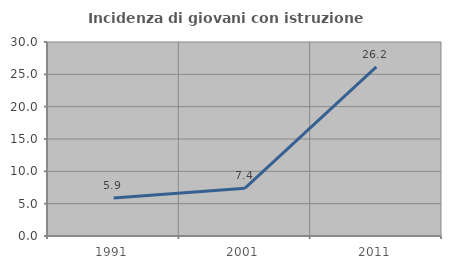
| Category | Incidenza di giovani con istruzione universitaria |
|---|---|
| 1991.0 | 5.87 |
| 2001.0 | 7.4 |
| 2011.0 | 26.164 |